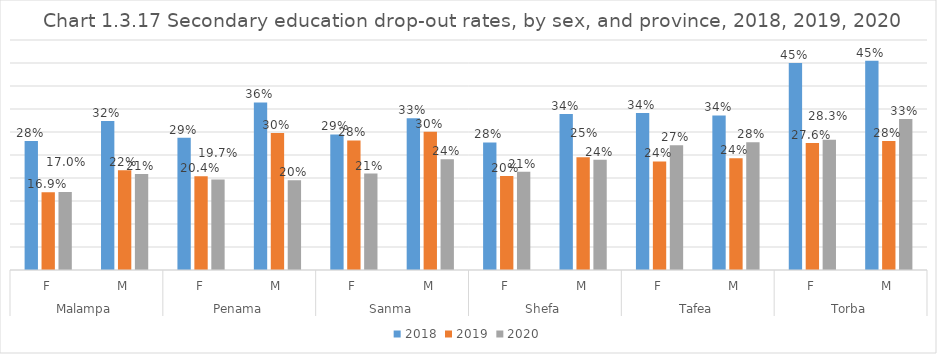
| Category | 2018 | 2019 | 2020 |
|---|---|---|---|
| 0 | 0.28 | 0.169 | 0.17 |
| 1 | 0.324 | 0.217 | 0.209 |
| 2 | 0.287 | 0.204 | 0.197 |
| 3 | 0.364 | 0.298 | 0.195 |
| 4 | 0.295 | 0.282 | 0.21 |
| 5 | 0.33 | 0.301 | 0.241 |
| 6 | 0.277 | 0.204 | 0.214 |
| 7 | 0.339 | 0.245 | 0.239 |
| 8 | 0.341 | 0.236 | 0.271 |
| 9 | 0.336 | 0.243 | 0.278 |
| 10 | 0.45 | 0.276 | 0.283 |
| 11 | 0.455 | 0.28 | 0.328 |